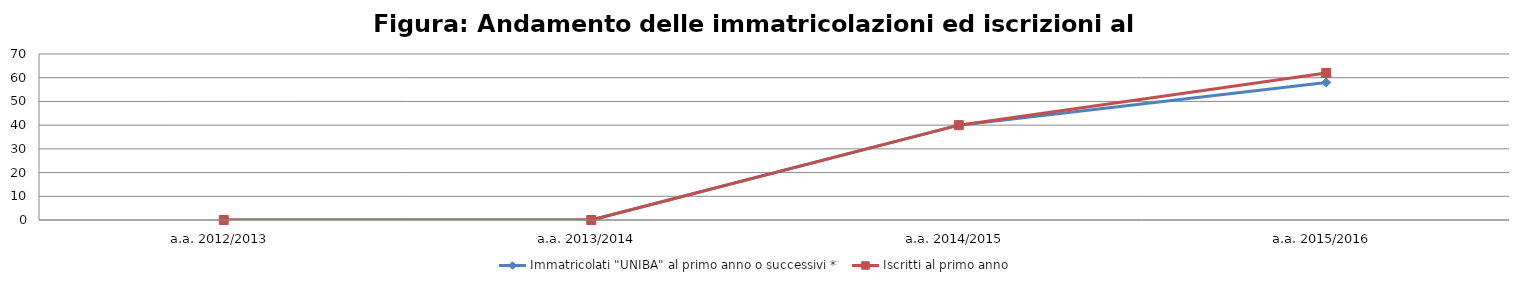
| Category | Immatricolati "UNIBA" al primo anno o successivi * | Iscritti al primo anno  |
|---|---|---|
| a.a. 2012/2013 | 0 | 0 |
| a.a. 2013/2014 | 0 | 0 |
| a.a. 2014/2015 | 40 | 40 |
| a.a. 2015/2016 | 58 | 62 |